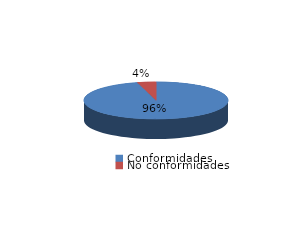
| Category | Series 0 |
|---|---|
| Conformidades | 550 |
| No conformidades | 24 |